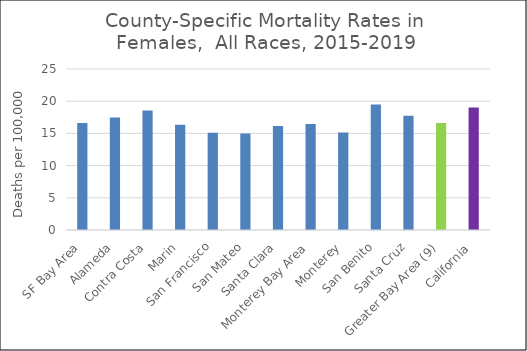
| Category | Female |
|---|---|
| SF Bay Area | 16.62 |
|   Alameda | 17.48 |
|   Contra Costa | 18.56 |
|   Marin | 16.36 |
|   San Francisco | 15.11 |
|   San Mateo | 14.99 |
|   Santa Clara | 16.13 |
| Monterey Bay Area | 16.47 |
|   Monterey | 15.15 |
|   San Benito | 19.48 |
|   Santa Cruz | 17.73 |
| Greater Bay Area (9) | 16.61 |
| California | 19.02 |